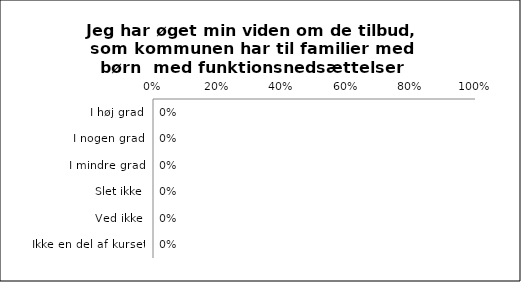
| Category | Øget viden om de tilbud kommunen har til familer med børn med funktionsnedsættelse |
|---|---|
| I høj grad | 0 |
| I nogen grad | 0 |
| I mindre grad | 0 |
| Slet ikke | 0 |
| Ved ikke | 0 |
| Ikke en del af kurset | 0 |